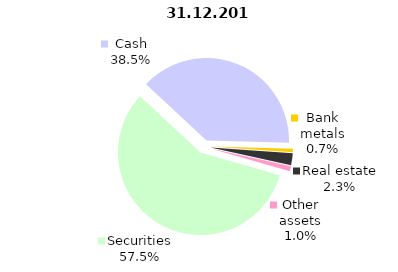
| Category | Total |
|---|---|
| Securities | 783.998 |
| Cash | 525.169 |
| Bank metals | 9.809 |
| Real estate | 31.721 |
| Other assets | 13.441 |